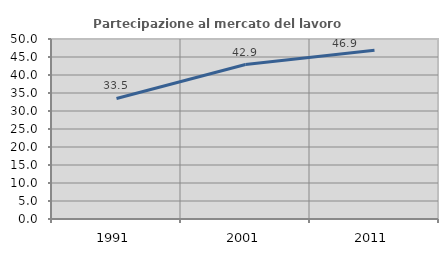
| Category | Partecipazione al mercato del lavoro  femminile |
|---|---|
| 1991.0 | 33.479 |
| 2001.0 | 42.913 |
| 2011.0 | 46.887 |